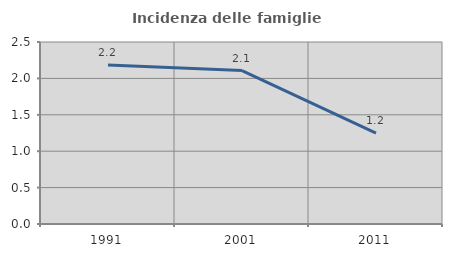
| Category | Incidenza delle famiglie numerose |
|---|---|
| 1991.0 | 2.183 |
| 2001.0 | 2.108 |
| 2011.0 | 1.247 |